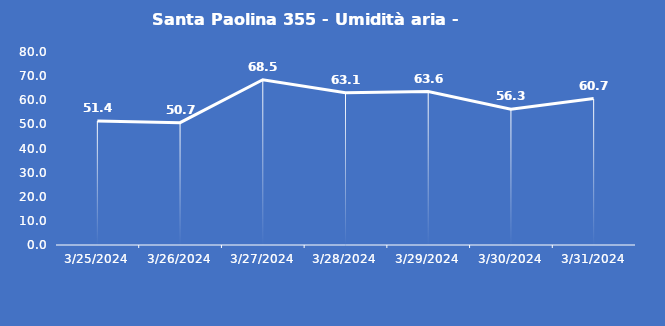
| Category | Santa Paolina 355 - Umidità aria - Grezzo (%) |
|---|---|
| 3/25/24 | 51.4 |
| 3/26/24 | 50.7 |
| 3/27/24 | 68.5 |
| 3/28/24 | 63.1 |
| 3/29/24 | 63.6 |
| 3/30/24 | 56.3 |
| 3/31/24 | 60.7 |